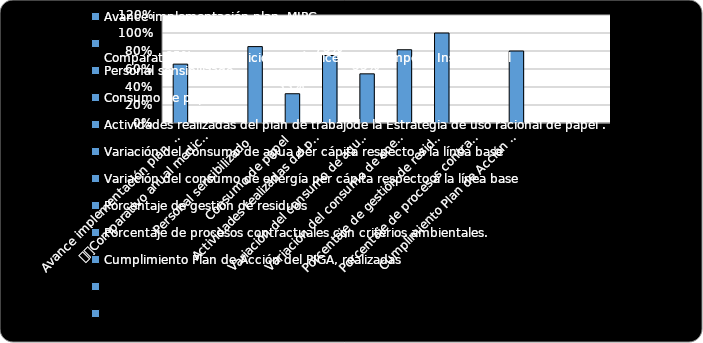
| Category | % Cumplimiento  |
|---|---|
| Avance implementación plan  MIPG  | 0.654 |
| 
Comparativo anual medición del Índice de Desempeño Institucional | 0 |
| Personal sensibilizado | 0.849 |
| Consumo de papel | 0.325 |
| Actividades realizadas del plan de trabajode la Estrategia de uso racional de papel .
 | 0.75 |
| Variación del consumo de agua per cápita respecto a la línea base | 0.546 |
| Variación del consumo de energía per cápita respecto a la línea base | 0.814 |
| Porcentaje de gestión de residuos | 1 |
| Porcentaje de procesos contractuales con criterios ambientales.  | 0 |
| Cumplimiento Plan de Acción del PIGA, realizadas | 0.8 |